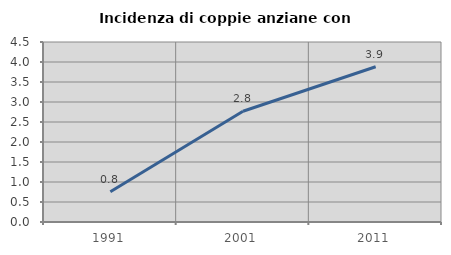
| Category | Incidenza di coppie anziane con figli |
|---|---|
| 1991.0 | 0.755 |
| 2001.0 | 2.769 |
| 2011.0 | 3.881 |